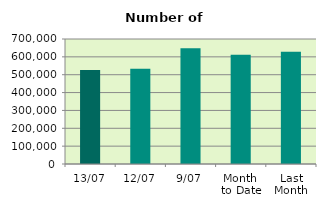
| Category | Series 0 |
|---|---|
| 13/07 | 526748 |
| 12/07 | 533526 |
| 9/07 | 647834 |
| Month 
to Date | 612175.556 |
| Last
Month | 628899 |